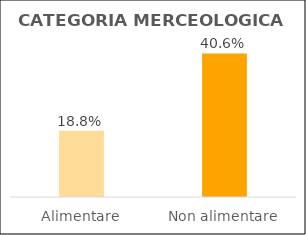
| Category | Series 0 |
|---|---|
| Alimentare | 0.188 |
| Non alimentare | 0.406 |